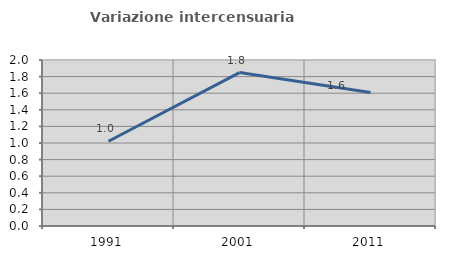
| Category | Variazione intercensuaria annua |
|---|---|
| 1991.0 | 1.021 |
| 2001.0 | 1.848 |
| 2011.0 | 1.608 |